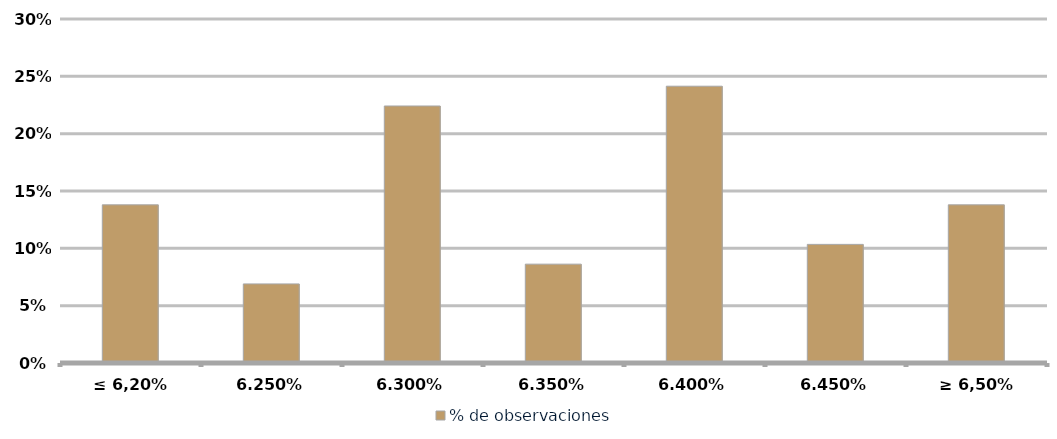
| Category | % de observaciones  |
|---|---|
| ≤ 6,20% | 0.138 |
| 6,25% | 0.069 |
| 6,30% | 0.224 |
| 6,35% | 0.086 |
| 6,40% | 0.241 |
| 6,45% | 0.103 |
| ≥ 6,50% | 0.138 |